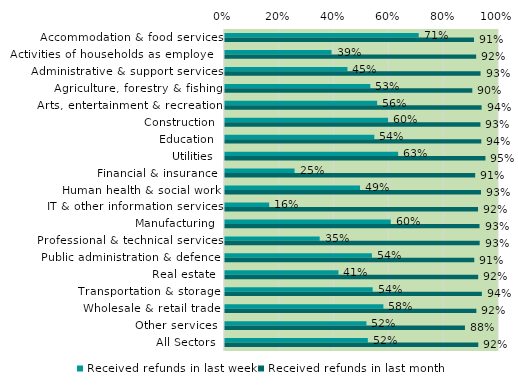
| Category | Received refunds in last week | Received refunds in last month |
|---|---|---|
| Accommodation & food services | 0.707 | 0.909 |
| Activities of households as employers | 0.389 | 0.917 |
| Administrative & support services | 0.447 | 0.933 |
| Agriculture, forestry & fishing | 0.53 | 0.903 |
| Arts, entertainment & recreation | 0.555 | 0.936 |
| Construction | 0.595 | 0.932 |
| Education | 0.545 | 0.935 |
| Utilities | 0.632 | 0.951 |
| Financial & insurance | 0.254 | 0.913 |
| Human health & social work | 0.493 | 0.934 |
| IT & other information services | 0.161 | 0.924 |
| Manufacturing | 0.605 | 0.929 |
| Professional & technical services | 0.346 | 0.929 |
| Public administration & defence | 0.536 | 0.91 |
| Real estate | 0.414 | 0.924 |
| Transportation & storage | 0.539 | 0.937 |
| Wholesale & retail trade | 0.578 | 0.917 |
| Other services | 0.516 | 0.876 |
| All Sectors | 0.521 | 0.924 |